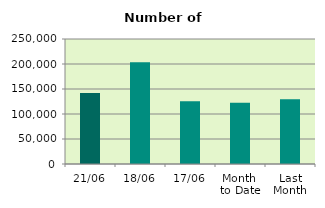
| Category | Series 0 |
|---|---|
| 21/06 | 141810 |
| 18/06 | 203500 |
| 17/06 | 125398 |
| Month 
to Date | 122605.867 |
| Last
Month | 129378.19 |